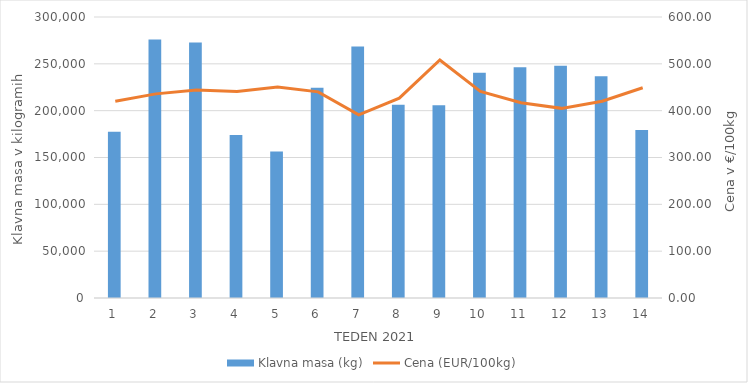
| Category | Klavna masa (kg) |
|---|---|
| 1.0 | 177573 |
| 2.0 | 275951 |
| 3.0 | 272797 |
| 4.0 | 174056 |
| 5.0 | 156508 |
| 6.0 | 224595 |
| 7.0 | 268436 |
| 8.0 | 206193 |
| 9.0 | 205669 |
| 10.0 | 240592 |
| 11.0 | 246325 |
| 12.0 | 248020 |
| 13.0 | 236703 |
| 14.0 | 179478 |